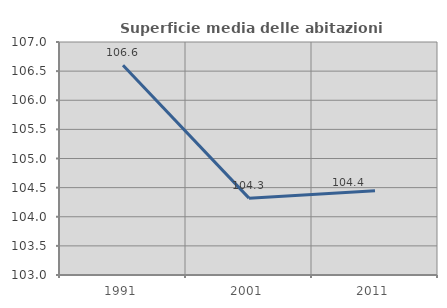
| Category | Superficie media delle abitazioni occupate |
|---|---|
| 1991.0 | 106.602 |
| 2001.0 | 104.319 |
| 2011.0 | 104.448 |